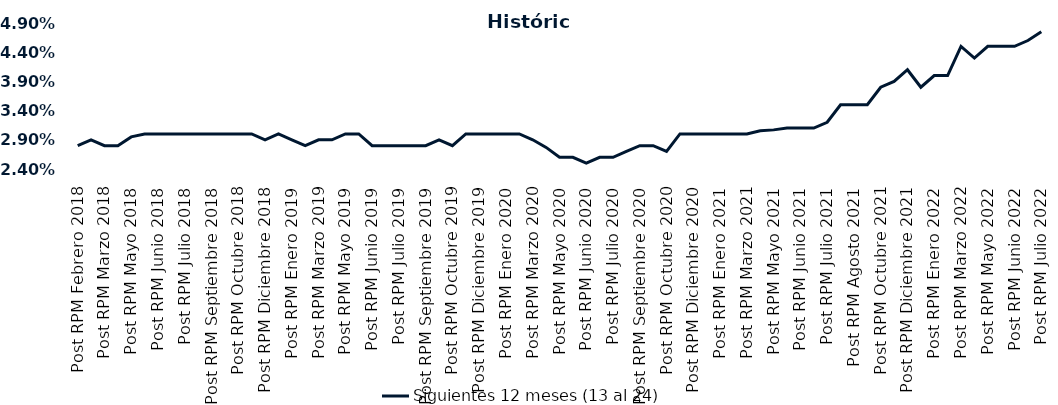
| Category | Siguientes 12 meses (13 al 24)  |
|---|---|
| Post RPM Febrero 2018 | 0.028 |
| Pre RPM Marzo 2018 | 0.029 |
| Post RPM Marzo 2018 | 0.028 |
| Pre RPM Mayo 2018 | 0.028 |
| Post RPM Mayo 2018 | 0.03 |
| Pre RPM Junio 2018 | 0.03 |
| Post RPM Junio 2018 | 0.03 |
| Pre RPM Julio 2018 | 0.03 |
| Post RPM Julio 2018 | 0.03 |
| Pre RPM Septiembre 2018 | 0.03 |
| Post RPM Septiembre 2018 | 0.03 |
| Pre RPM Octubre 2018 | 0.03 |
| Post RPM Octubre 2018 | 0.03 |
| Pre RPM Diciembre 2018 | 0.03 |
| Post RPM Diciembre 2018 | 0.029 |
| Pre RPM Enero 2019 | 0.03 |
| Post RPM Enero 2019 | 0.029 |
| Pre RPM Marzo 2019 | 0.028 |
| Post RPM Marzo 2019 | 0.029 |
| Pre RPM Mayo 2019 | 0.029 |
| Post RPM Mayo 2019 | 0.03 |
| Pre RPM Junio 2019 | 0.03 |
| Post RPM Junio 2019 | 0.028 |
| Pre RPM Julio 2019 | 0.028 |
| Post RPM Julio 2019 | 0.028 |
| Pre RPM Septiembre 2019 | 0.028 |
| Post RPM Septiembre 2019 | 0.028 |
| Pre RPM Octubre 2019 | 0.029 |
| Post RPM Octubre 2019 | 0.028 |
| Pre RPM Diciembre 2019 | 0.03 |
| Post RPM Diciembre 2019 | 0.03 |
| Pre RPM Enero 2020 | 0.03 |
| Post RPM Enero 2020 | 0.03 |
| Pre RPM Marzo 2020 | 0.03 |
| Post RPM Marzo 2020 | 0.029 |
| Pre RPM Mayo 2020 | 0.028 |
| Post RPM Mayo 2020 | 0.026 |
| Pre RPM Junio 2020 | 0.026 |
| Post RPM Junio 2020 | 0.025 |
| Pre RPM Julio 2020 | 0.026 |
| Post RPM Julio 2020 | 0.026 |
| Pre RPM Septiembre 2020 | 0.027 |
| Post RPM Septiembre 2020 | 0.028 |
| Pre RPM Octubre 2020 | 0.028 |
| Post RPM Octubre 2020 | 0.027 |
| Pre RPM Diciembre 2020 | 0.03 |
| Post RPM Diciembre 2020 | 0.03 |
| Pre RPM Enero 2021 | 0.03 |
| Post RPM Enero 2021 | 0.03 |
| Pre RPM Marzo 2021 | 0.03 |
| Post RPM Marzo 2021 | 0.03 |
| Pre RPM Mayo 2021 | 0.031 |
| Post RPM Mayo 2021 | 0.031 |
| Pre RPM Junio 2021 | 0.031 |
| Post RPM Junio 2021 | 0.031 |
| Pre RPM Julio 2021 | 0.031 |
| Post RPM Julio 2021 | 0.032 |
| Pre RPM Agosto 2021 | 0.035 |
| Post RPM Agosto 2021 | 0.035 |
| Pre RPM Octubre 2021 | 0.035 |
| Post RPM Octubre 2021 | 0.038 |
| Pre RPM Diciembre 2021 | 0.039 |
| Post RPM Diciembre 2021 | 0.041 |
| Pre RPM Enero 2022 | 0.038 |
| Post RPM Enero 2022 | 0.04 |
| Pre RPM Marzo 2022 | 0.04 |
| Post RPM Marzo 2022 | 0.045 |
| Pre RPM Mayo 2022 | 0.043 |
| Post RPM Mayo 2022 | 0.045 |
| Pre RPM Junio 2022 | 0.045 |
| Post RPM Junio 2022 | 0.045 |
| Pre RPM Julio 2022 | 0.046 |
| Post RPM Julio 2022 | 0.048 |